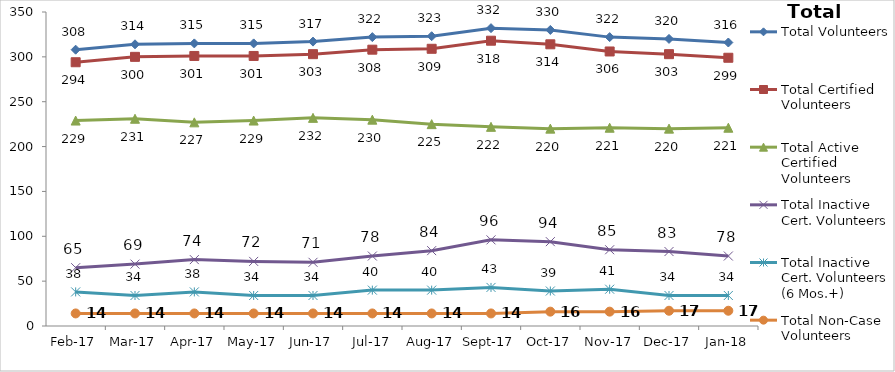
| Category | Total Volunteers | Total Certified Volunteers | Total Active Certified Volunteers | Total Inactive Cert. Volunteers | Total Inactive Cert. Volunteers (6 Mos.+) | Total Non-Case Volunteers |
|---|---|---|---|---|---|---|
| 2017-02-01 | 308 | 294 | 229 | 65 | 38 | 14 |
| 2017-03-01 | 314 | 300 | 231 | 69 | 34 | 14 |
| 2017-04-01 | 315 | 301 | 227 | 74 | 38 | 14 |
| 2017-05-01 | 315 | 301 | 229 | 72 | 34 | 14 |
| 2017-06-01 | 317 | 303 | 232 | 71 | 34 | 14 |
| 2017-07-01 | 322 | 308 | 230 | 78 | 40 | 14 |
| 2017-08-01 | 323 | 309 | 225 | 84 | 40 | 14 |
| 2017-09-01 | 332 | 318 | 222 | 96 | 43 | 14 |
| 2017-10-01 | 330 | 314 | 220 | 94 | 39 | 16 |
| 2017-11-01 | 322 | 306 | 221 | 85 | 41 | 16 |
| 2017-12-01 | 320 | 303 | 220 | 83 | 34 | 17 |
| 2018-01-01 | 316 | 299 | 221 | 78 | 34 | 17 |